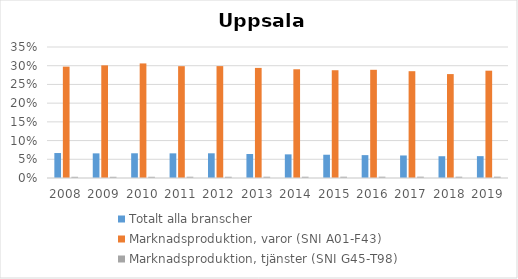
| Category | Totalt alla branscher | Marknadsproduktion, varor (SNI A01-F43) | Marknadsproduktion, tjänster (SNI G45-T98) |
|---|---|---|---|
| 2008.0 | 0.067 | 0.298 | 0.003 |
| 2009.0 | 0.066 | 0.301 | 0.003 |
| 2010.0 | 0.066 | 0.306 | 0.003 |
| 2011.0 | 0.066 | 0.299 | 0.003 |
| 2012.0 | 0.066 | 0.299 | 0.003 |
| 2013.0 | 0.064 | 0.294 | 0.003 |
| 2014.0 | 0.063 | 0.29 | 0.003 |
| 2015.0 | 0.062 | 0.288 | 0.003 |
| 2016.0 | 0.061 | 0.289 | 0.003 |
| 2017.0 | 0.06 | 0.285 | 0.004 |
| 2018.0 | 0.058 | 0.278 | 0.003 |
| 2019.0 | 0.058 | 0.287 | 0.004 |